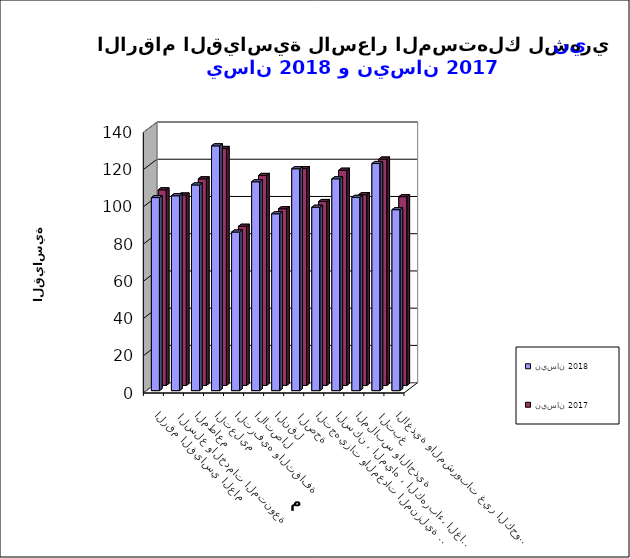
| Category | نيسان 2018      | نيسان 2017 |
|---|---|---|
| الاغذية والمشروبات غير الكحولية | 97.2 | 101.4 |
|  التبغ | 122 | 121.6 |
| الملابس والاحذية | 103.8 | 102.5 |
| السكن ، المياه ، الكهرباء، الغاز  | 113.8 | 115.6 |
| التجهيزات والمعدات المنزلية والصيانة | 98.5 | 98.8 |
|  الصحة | 119.2 | 116.5 |
| النقل | 95 | 94.9 |
| الاتصال | 112.2 | 112.8 |
| الترفيه والثقافة | 85.2 | 85.5 |
| التعليم | 131.5 | 127.3 |
| المطاعم  | 110.5 | 111 |
|  السلع والخدمات المتنوعة | 104.7 | 102.3 |
| الرقم القياسي العام | 103.7 | 105.1 |